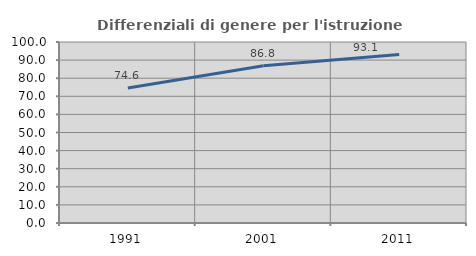
| Category | Differenziali di genere per l'istruzione superiore |
|---|---|
| 1991.0 | 74.571 |
| 2001.0 | 86.83 |
| 2011.0 | 93.055 |